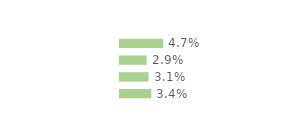
| Category | Series 0 |
|---|---|
| Modeste | 0.047 |
| Médian inférieur | 0.029 |
| Médian supérieur | 0.031 |
| Aisé | 0.034 |